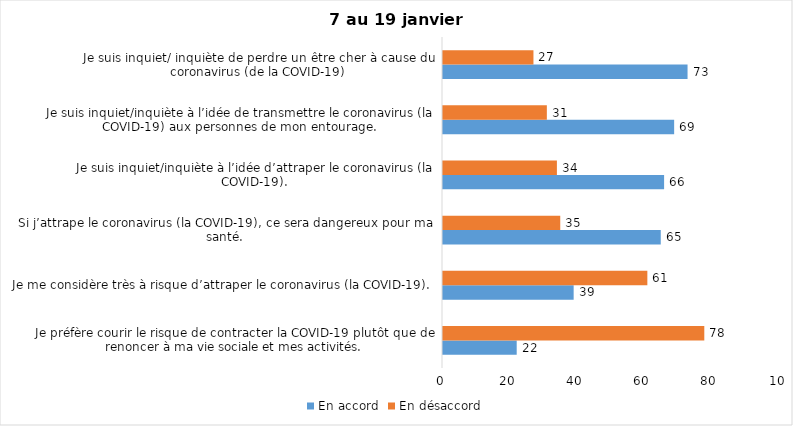
| Category | En accord | En désaccord |
|---|---|---|
| Je préfère courir le risque de contracter la COVID-19 plutôt que de renoncer à ma vie sociale et mes activités. | 22 | 78 |
| Je me considère très à risque d’attraper le coronavirus (la COVID-19). | 39 | 61 |
| Si j’attrape le coronavirus (la COVID-19), ce sera dangereux pour ma santé. | 65 | 35 |
| Je suis inquiet/inquiète à l’idée d’attraper le coronavirus (la COVID-19). | 66 | 34 |
| Je suis inquiet/inquiète à l’idée de transmettre le coronavirus (la COVID-19) aux personnes de mon entourage. | 69 | 31 |
| Je suis inquiet/ inquiète de perdre un être cher à cause du coronavirus (de la COVID-19) | 73 | 27 |